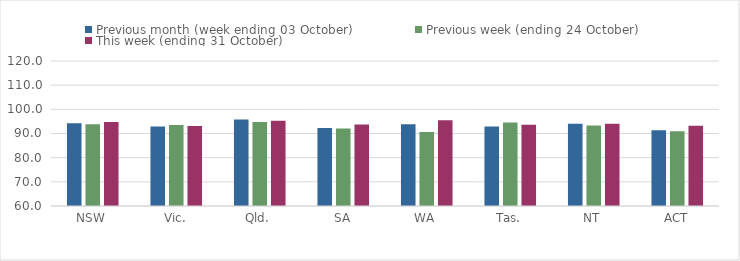
| Category | Previous month (week ending 03 October) | Previous week (ending 24 October) | This week (ending 31 October) |
|---|---|---|---|
| NSW | 94.24 | 93.81 | 94.78 |
| Vic. | 92.9 | 93.48 | 93.11 |
| Qld. | 95.8 | 94.8 | 95.28 |
| SA | 92.25 | 92.07 | 93.77 |
| WA | 93.84 | 90.63 | 95.45 |
| Tas. | 92.91 | 94.57 | 93.61 |
| NT | 94.01 | 93.3 | 94.03 |
| ACT | 91.38 | 90.93 | 93.16 |